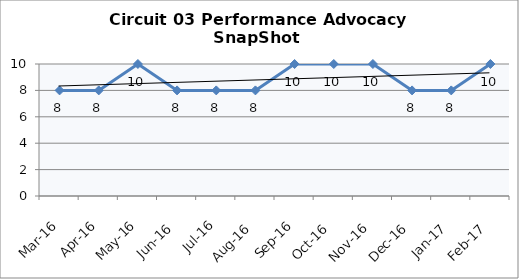
| Category | Circuit 03 |
|---|---|
| Mar-16 | 8 |
| Apr-16 | 8 |
| May-16 | 10 |
| Jun-16 | 8 |
| Jul-16 | 8 |
| Aug-16 | 8 |
| Sep-16 | 10 |
| Oct-16 | 10 |
| Nov-16 | 10 |
| Dec-16 | 8 |
| Jan-17 | 8 |
| Feb-17 | 10 |